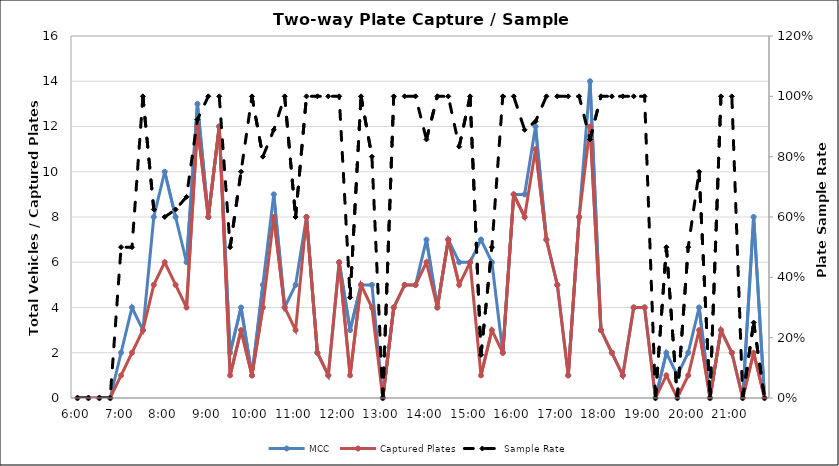
| Category | MCC | Captured Plates |
|---|---|---|
| 0.25 | 0 | 0 |
| 0.260416666666667 | 0 | 0 |
| 0.270833333333333 | 0 | 0 |
| 0.28125 | 0 | 0 |
| 0.291666666666667 | 2 | 1 |
| 0.302083333333333 | 4 | 2 |
| 0.3125 | 3 | 3 |
| 0.322916666666667 | 8 | 5 |
| 0.333333333333333 | 10 | 6 |
| 0.34375 | 8 | 5 |
| 0.354166666666667 | 6 | 4 |
| 0.364583333333333 | 13 | 12 |
| 0.375 | 8 | 8 |
| 0.385416666666667 | 12 | 12 |
| 0.395833333333333 | 2 | 1 |
| 0.40625 | 4 | 3 |
| 0.416666666666667 | 1 | 1 |
| 0.427083333333333 | 5 | 4 |
| 0.4375 | 9 | 8 |
| 0.447916666666667 | 4 | 4 |
| 0.458333333333333 | 5 | 3 |
| 0.46875 | 8 | 8 |
| 0.479166666666667 | 2 | 2 |
| 0.489583333333333 | 1 | 1 |
| 0.5 | 6 | 6 |
| 0.510416666666667 | 3 | 1 |
| 0.520833333333333 | 5 | 5 |
| 0.53125 | 5 | 4 |
| 0.541666666666667 | 0 | 0 |
| 0.552083333333333 | 4 | 4 |
| 0.5625 | 5 | 5 |
| 0.572916666666667 | 5 | 5 |
| 0.583333333333333 | 7 | 6 |
| 0.59375 | 4 | 4 |
| 0.604166666666667 | 7 | 7 |
| 0.614583333333333 | 6 | 5 |
| 0.625 | 6 | 6 |
| 0.635416666666667 | 7 | 1 |
| 0.645833333333333 | 6 | 3 |
| 0.65625 | 2 | 2 |
| 0.666666666666667 | 9 | 9 |
| 0.677083333333333 | 9 | 8 |
| 0.6875 | 12 | 11 |
| 0.697916666666667 | 7 | 7 |
| 0.708333333333333 | 5 | 5 |
| 0.71875 | 1 | 1 |
| 0.729166666666667 | 8 | 8 |
| 0.739583333333333 | 14 | 12 |
| 0.75 | 3 | 3 |
| 0.760416666666667 | 2 | 2 |
| 0.770833333333333 | 1 | 1 |
| 0.78125 | 4 | 4 |
| 0.791666666666667 | 4 | 4 |
| 0.802083333333333 | 0 | 0 |
| 0.8125 | 2 | 1 |
| 0.822916666666667 | 1 | 0 |
| 0.833333333333333 | 2 | 1 |
| 0.84375 | 4 | 3 |
| 0.854166666666667 | 0 | 0 |
| 0.864583333333333 | 3 | 3 |
| 0.875 | 2 | 2 |
| 0.885416666666667 | 0 | 0 |
| 0.895833333333333 | 8 | 2 |
| 0.90625 | 0 | 0 |